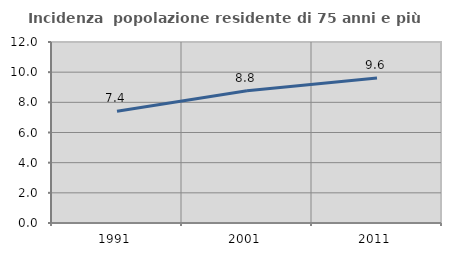
| Category | Incidenza  popolazione residente di 75 anni e più |
|---|---|
| 1991.0 | 7.407 |
| 2001.0 | 8.769 |
| 2011.0 | 9.616 |